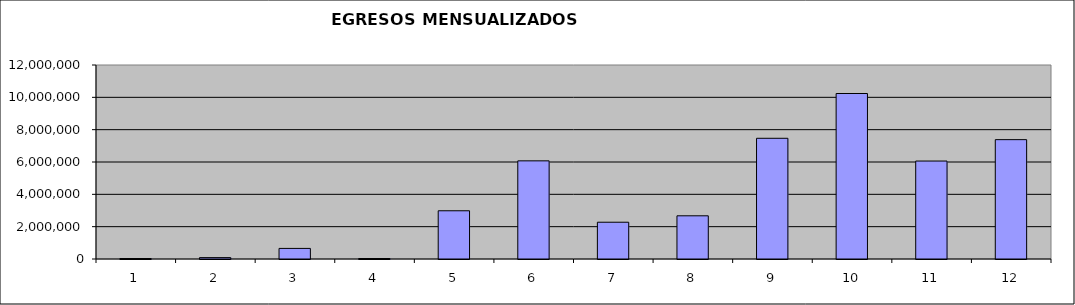
| Category | Series 0 |
|---|---|
| 0 | 30000 |
| 1 | 85293.8 |
| 2 | 655000 |
| 3 | 30000 |
| 4 | 2983099.608 |
| 5 | 6070921.415 |
| 6 | 2274877.726 |
| 7 | 2671720.212 |
| 8 | 7466240.991 |
| 9 | 10236179.492 |
| 10 | 6059754.497 |
| 11 | 7383012.979 |